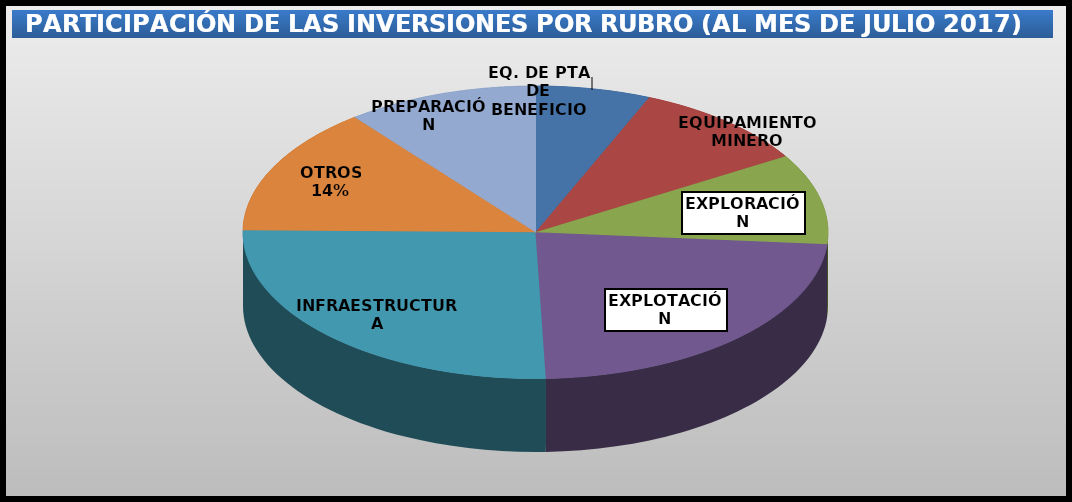
| Category | Series 0 |
|---|---|
| EQ. DE PTA DE BENEFICIO | 150475677.62 |
| EQUIPAMIENTO MINERO | 236407004.19 |
| EXPLORACIÓN | 237082109.38 |
| EXPLOTACIÓN | 548713982.31 |
| INFRAESTRUCTURA | 611079973.83 |
| OTROS | 336513884.52 |
| PREPARACIÓN | 251577747.7 |